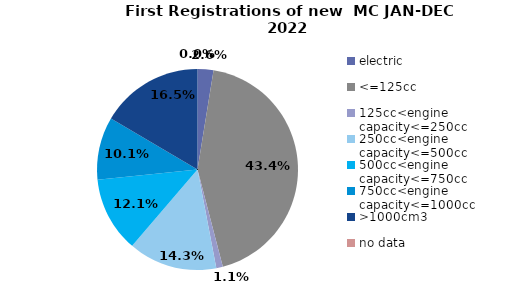
| Category | Series 0 |
|---|---|
| electric | 612 |
| <=125cc | 10373 |
| 125cc<engine capacity<=250cc | 252 |
| 250cc<engine capacity<=500cc | 3411 |
| 500cc<engine capacity<=750cc | 2899 |
| 750cc<engine capacity<=1000cc | 2416 |
| >1000cm3 | 3947 |
| no data | 0 |